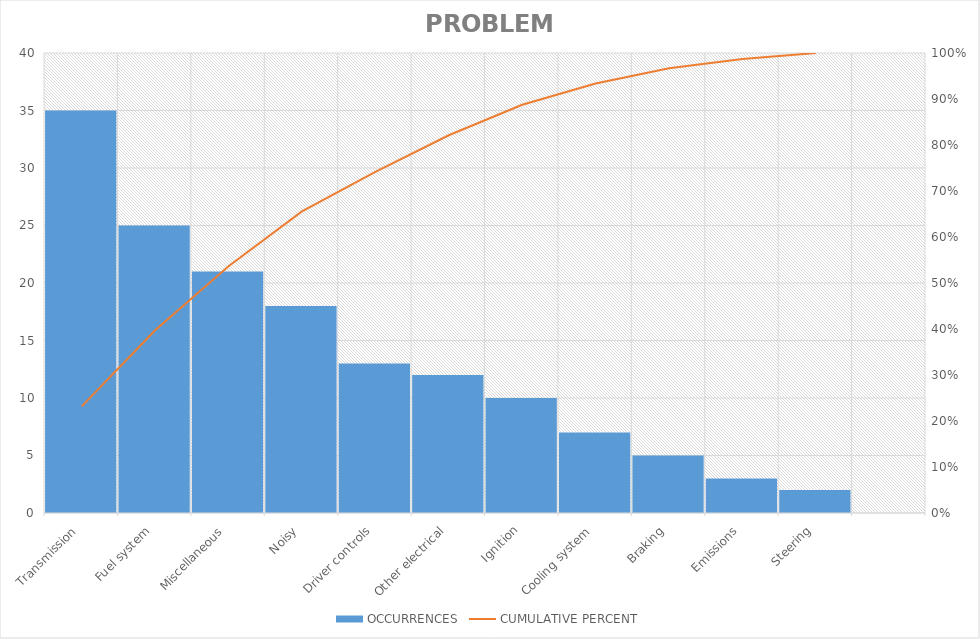
| Category | OCCURRENCES |
|---|---|
| Transmission | 35 |
| Fuel system | 25 |
| Miscellaneous | 21 |
| Noisy | 18 |
| Driver controls | 13 |
| Other electrical | 12 |
| Ignition | 10 |
| Cooling system | 7 |
| Braking | 5 |
| Emissions | 3 |
| Steering | 2 |